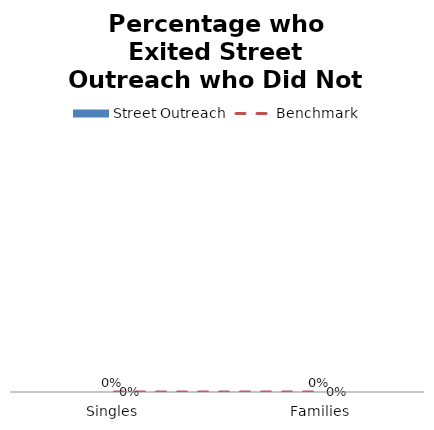
| Category | Street Outreach |
|---|---|
| Singles | 0 |
| Families | 0 |